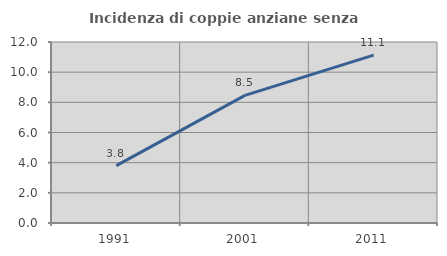
| Category | Incidenza di coppie anziane senza figli  |
|---|---|
| 1991.0 | 3.802 |
| 2001.0 | 8.461 |
| 2011.0 | 11.128 |